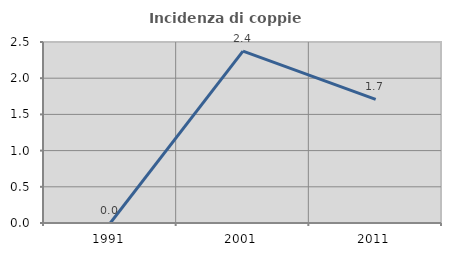
| Category | Incidenza di coppie miste |
|---|---|
| 1991.0 | 0 |
| 2001.0 | 2.373 |
| 2011.0 | 1.706 |